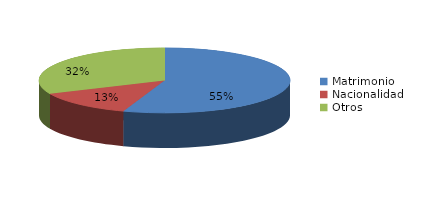
| Category | Series 0 |
|---|---|
| Matrimonio | 2415 |
| Nacionalidad | 568 |
| Otros | 1386 |